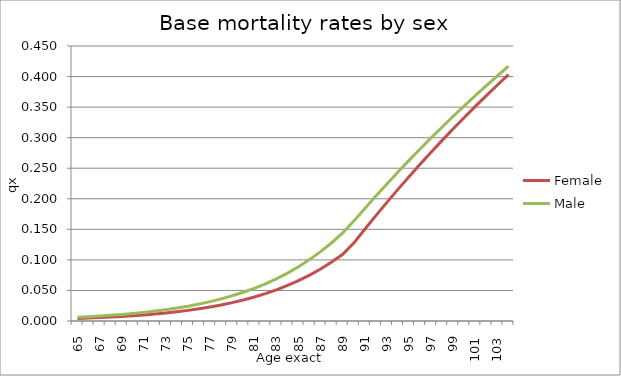
| Category | Female | Male |
|---|---|---|
| 65.0 | 0.004 | 0.006 |
| 66.0 | 0.005 | 0.007 |
| 67.0 | 0.006 | 0.008 |
| 68.0 | 0.006 | 0.009 |
| 69.0 | 0.007 | 0.011 |
| 70.0 | 0.009 | 0.012 |
| 71.0 | 0.01 | 0.014 |
| 72.0 | 0.011 | 0.016 |
| 73.0 | 0.013 | 0.019 |
| 74.0 | 0.015 | 0.021 |
| 75.0 | 0.017 | 0.024 |
| 76.0 | 0.02 | 0.028 |
| 77.0 | 0.023 | 0.032 |
| 78.0 | 0.026 | 0.036 |
| 79.0 | 0.03 | 0.041 |
| 80.0 | 0.034 | 0.047 |
| 81.0 | 0.039 | 0.053 |
| 82.0 | 0.045 | 0.061 |
| 83.0 | 0.051 | 0.069 |
| 84.0 | 0.058 | 0.078 |
| 85.0 | 0.066 | 0.089 |
| 86.0 | 0.075 | 0.1 |
| 87.0 | 0.085 | 0.114 |
| 88.0 | 0.096 | 0.128 |
| 89.0 | 0.109 | 0.144 |
| 90.0 | 0.128 | 0.163 |
| 91.0 | 0.15 | 0.184 |
| 92.0 | 0.172 | 0.204 |
| 93.0 | 0.194 | 0.224 |
| 94.0 | 0.215 | 0.244 |
| 95.0 | 0.236 | 0.263 |
| 96.0 | 0.256 | 0.281 |
| 97.0 | 0.276 | 0.3 |
| 98.0 | 0.296 | 0.318 |
| 99.0 | 0.315 | 0.335 |
| 100.0 | 0.333 | 0.352 |
| 101.0 | 0.351 | 0.369 |
| 102.0 | 0.369 | 0.385 |
| 103.0 | 0.386 | 0.401 |
| 104.0 | 0.403 | 0.417 |